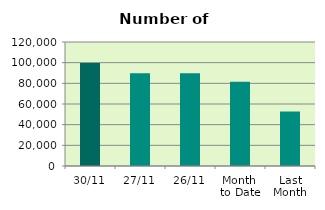
| Category | Series 0 |
|---|---|
| 30/11 | 99688 |
| 27/11 | 89854 |
| 26/11 | 89640 |
| Month 
to Date | 81433.048 |
| Last
Month | 52845 |